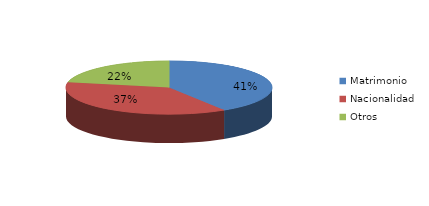
| Category | Series 0 |
|---|---|
| Matrimonio | 1840 |
| Nacionalidad | 1671 |
| Otros | 974 |